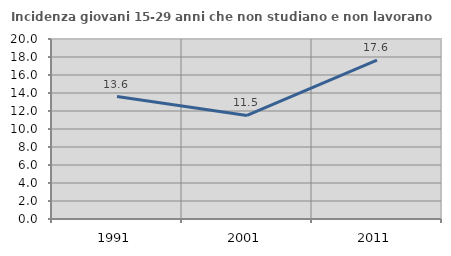
| Category | Incidenza giovani 15-29 anni che non studiano e non lavorano  |
|---|---|
| 1991.0 | 13.607 |
| 2001.0 | 11.502 |
| 2011.0 | 17.647 |